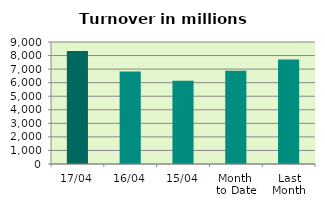
| Category | Series 0 |
|---|---|
| 17/04 | 8337.626 |
| 16/04 | 6819.231 |
| 15/04 | 6134.183 |
| Month 
to Date | 6875.326 |
| Last
Month | 7711.184 |